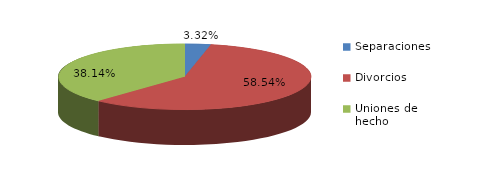
| Category | Series 0 |
|---|---|
| Separaciones | 69 |
| Divorcios | 1217 |
| Uniones de hecho | 793 |